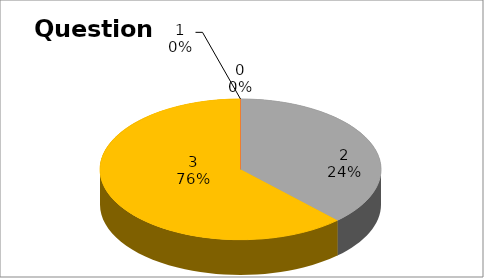
| Category | Series 0 |
|---|---|
| 0 | 0 |
| 1 | 0 |
| 2 | 36 |
| 3 | 59 |